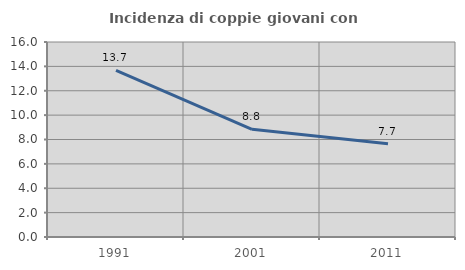
| Category | Incidenza di coppie giovani con figli |
|---|---|
| 1991.0 | 13.672 |
| 2001.0 | 8.838 |
| 2011.0 | 7.66 |